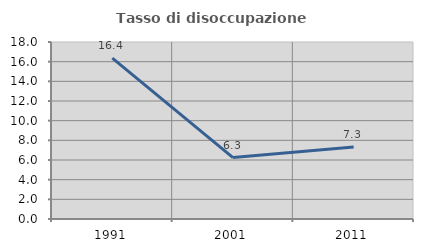
| Category | Tasso di disoccupazione giovanile  |
|---|---|
| 1991.0 | 16.364 |
| 2001.0 | 6.25 |
| 2011.0 | 7.317 |